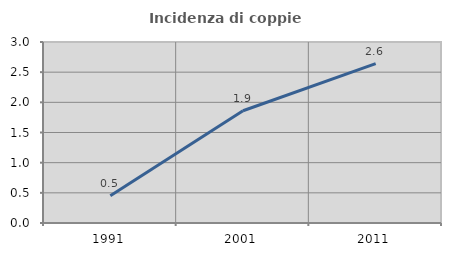
| Category | Incidenza di coppie miste |
|---|---|
| 1991.0 | 0.451 |
| 2001.0 | 1.86 |
| 2011.0 | 2.643 |